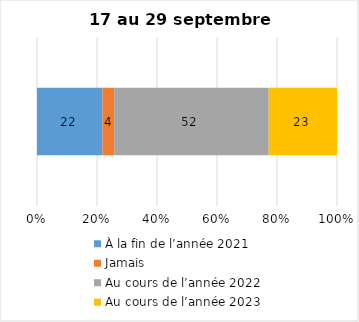
| Category | À la fin de l’année 2021 | Jamais | Au cours de l’année 2022 | Au cours de l’année 2023 |
|---|---|---|---|---|
| 0 | 22 | 4 | 52 | 23 |